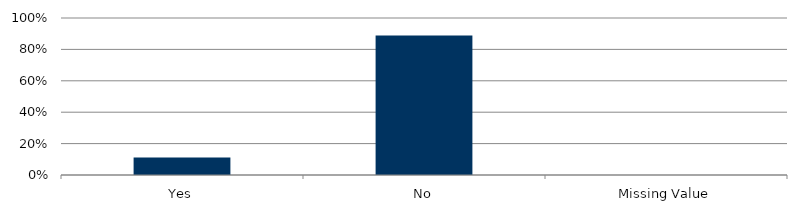
| Category | Total |
|---|---|
| Yes | 0.112 |
| No | 0.888 |
| Missing Value | 0 |